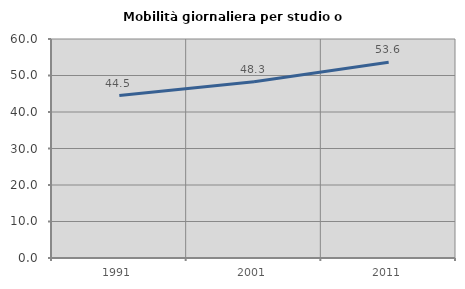
| Category | Mobilità giornaliera per studio o lavoro |
|---|---|
| 1991.0 | 44.51 |
| 2001.0 | 48.265 |
| 2011.0 | 53.647 |